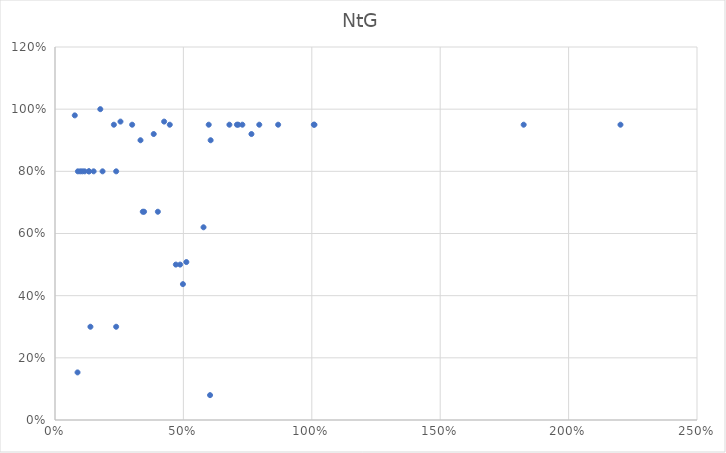
| Category | NtG |
|---|---|
| 0.08779905785532795 | 0.153 |
| 0.5114775830025832 | 0.508 |
| 0.49816752126101205 | 0.437 |
| 0.5985896199917875 | 0.95 |
| 0.255 | 0.96 |
| 0.425 | 0.96 |
| 0.7083665431309906 | 0.95 |
| 0.3418606160723334 | 0.67 |
| 0.3468963782449767 | 0.67 |
| 0.4005345515518176 | 0.67 |
| 0.7296089964847151 | 0.95 |
| 0.7954526319334524 | 0.95 |
| 2.2019907822301885 | 0.95 |
| 0.765 | 0.92 |
| 1.0078571428571428 | 0.95 |
| 0.6060934555960306 | 0.9 |
| 1.8250513217778639 | 0.95 |
| 0.713438613731007 | 0.95 |
| 0.4469386132963763 | 0.95 |
| 0.6791197789113796 | 0.95 |
| 1.0103388819474197 | 0.95 |
| 0.4705958700545919 | 0.5 |
| 0.5783457760579749 | 0.62 |
| 0.603777570507484 | 0.08 |
| 0.3329387856759323 | 0.9 |
| 0.48729764265667874 | 0.5 |
| 0.13798735714081703 | 0.3 |
| 0.23812673820542404 | 0.3 |
| 0.2292633677917187 | 0.95 |
| 0.3004565165722691 | 0.95 |
| 0.8689485733381624 | 0.95 |
| 0.3844130519004004 | 0.92 |
| 0.17642062729391247 | 1 |
| 0.150474027799469 | 0.8 |
| 0.07702756699209459 | 0.98 |
| 0.11546876123545682 | 0.8 |
| 0.09824764701683543 | 0.8 |
| 0.2382505440158259 | 0.8 |
| 0.18516881659261078 | 0.8 |
| 0.13241249841095687 | 0.8 |
| 0.10659979598023529 | 0.8 |
| 0.08914894069815749 | 0.8 |
| 0.13188516137050976 | 0.8 |